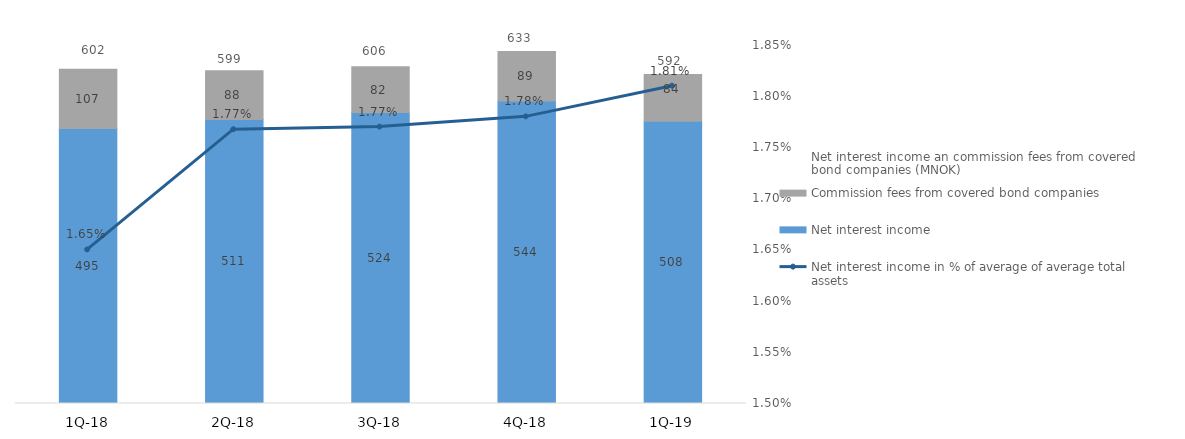
| Category | Net interest income | Commission fees from covered bond companies |
|---|---|---|
| 1Q-19 | 508 | 84.15 |
| 4Q-18 | 544.32 | 88.95 |
| 3Q-18 | 523.87 | 81.9 |
| 2Q-18 | 511.1 | 87.5 |
| 1Q-18 | 495 | 106.7 |